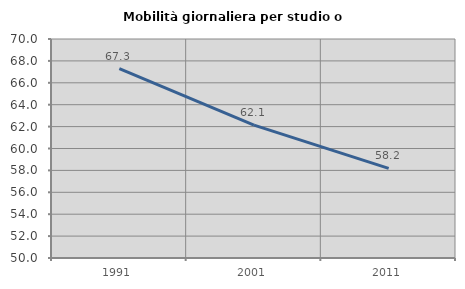
| Category | Mobilità giornaliera per studio o lavoro |
|---|---|
| 1991.0 | 67.29 |
| 2001.0 | 62.13 |
| 2011.0 | 58.182 |